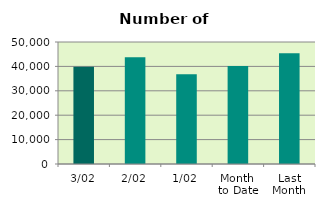
| Category | Series 0 |
|---|---|
| 3/02 | 39890 |
| 2/02 | 43720 |
| 1/02 | 36830 |
| Month 
to Date | 40146.667 |
| Last
Month | 45378.8 |